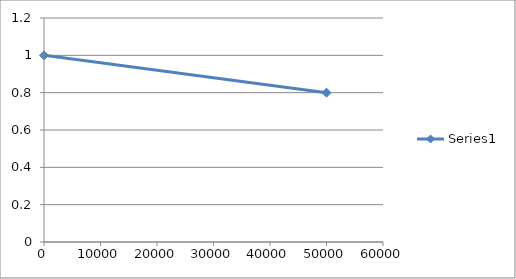
| Category | Series 0 |
|---|---|
| 0.0 | 1 |
| 50000.0 | 0.8 |